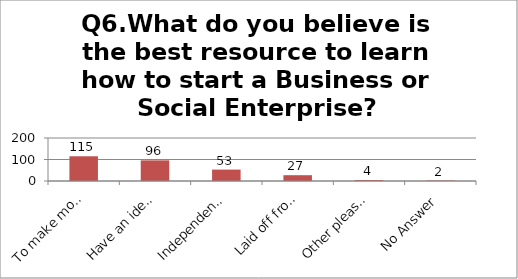
| Category | Q6.What do you believe is the best resource to learn how to start a Business or Social Enterprise? |
|---|---|
| To make money | 115 |
| Have an idea and want to see it in action | 96 |
| Independence | 53 |
| Laid off from a company/unemployed | 27 |
| Other please specify | 4 |
| No Answer | 2 |